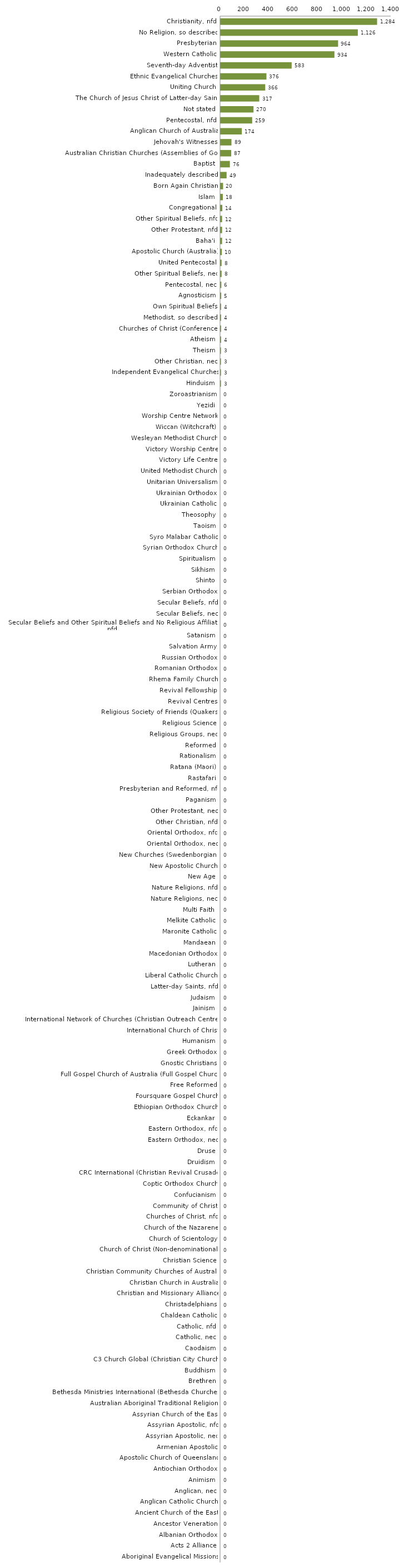
| Category | Series 0 |
|---|---|
| Christianity, nfd | 1284 |
| No Religion, so described | 1126 |
| Presbyterian | 964 |
| Western Catholic | 934 |
| Seventh-day Adventist | 583 |
| Ethnic Evangelical Churches | 376 |
| Uniting Church | 366 |
| The Church of Jesus Christ of Latter-day Saints | 317 |
| Not stated | 270 |
| Pentecostal, nfd | 259 |
| Anglican Church of Australia | 174 |
| Jehovah's Witnesses | 89 |
| Australian Christian Churches (Assemblies of God) | 87 |
| Baptist | 76 |
| Inadequately described | 49 |
| Born Again Christian | 20 |
| Islam | 18 |
| Congregational | 14 |
| Other Spiritual Beliefs, nfd | 12 |
| Other Protestant, nfd | 12 |
| Baha'i | 12 |
| Apostolic Church (Australia) | 10 |
| United Pentecostal | 8 |
| Other Spiritual Beliefs, nec | 8 |
| Pentecostal, nec | 6 |
| Agnosticism | 5 |
| Own Spiritual Beliefs | 4 |
| Methodist, so described | 4 |
| Churches of Christ (Conference) | 4 |
| Atheism | 4 |
| Theism | 3 |
| Other Christian, nec | 3 |
| Independent Evangelical Churches | 3 |
| Hinduism | 3 |
| Zoroastrianism | 0 |
| Yezidi | 0 |
| Worship Centre Network | 0 |
| Wiccan (Witchcraft) | 0 |
| Wesleyan Methodist Church | 0 |
| Victory Worship Centre | 0 |
| Victory Life Centre | 0 |
| United Methodist Church | 0 |
| Unitarian Universalism | 0 |
| Ukrainian Orthodox | 0 |
| Ukrainian Catholic | 0 |
| Theosophy | 0 |
| Taoism | 0 |
| Syro Malabar Catholic | 0 |
| Syrian Orthodox Church | 0 |
| Spiritualism | 0 |
| Sikhism | 0 |
| Shinto | 0 |
| Serbian Orthodox | 0 |
| Secular Beliefs, nfd | 0 |
| Secular Beliefs, nec | 0 |
| Secular Beliefs and Other Spiritual Beliefs and No Religious Affiliation, nfd | 0 |
| Satanism | 0 |
| Salvation Army | 0 |
| Russian Orthodox | 0 |
| Romanian Orthodox | 0 |
| Rhema Family Church | 0 |
| Revival Fellowship | 0 |
| Revival Centres | 0 |
| Religious Society of Friends (Quakers) | 0 |
| Religious Science | 0 |
| Religious Groups, nec | 0 |
| Reformed | 0 |
| Rationalism | 0 |
| Ratana (Maori) | 0 |
| Rastafari | 0 |
| Presbyterian and Reformed, nfd | 0 |
| Paganism | 0 |
| Other Protestant, nec | 0 |
| Other Christian, nfd | 0 |
| Oriental Orthodox, nfd | 0 |
| Oriental Orthodox, nec | 0 |
| New Churches (Swedenborgian) | 0 |
| New Apostolic Church | 0 |
| New Age | 0 |
| Nature Religions, nfd | 0 |
| Nature Religions, nec | 0 |
| Multi Faith | 0 |
| Melkite Catholic | 0 |
| Maronite Catholic | 0 |
| Mandaean | 0 |
| Macedonian Orthodox | 0 |
| Lutheran | 0 |
| Liberal Catholic Church | 0 |
| Latter-day Saints, nfd | 0 |
| Judaism | 0 |
| Jainism | 0 |
| International Network of Churches (Christian Outreach Centres) | 0 |
| International Church of Christ | 0 |
| Humanism | 0 |
| Greek Orthodox | 0 |
| Gnostic Christians | 0 |
| Full Gospel Church of Australia (Full Gospel Church) | 0 |
| Free Reformed | 0 |
| Foursquare Gospel Church | 0 |
| Ethiopian Orthodox Church | 0 |
| Eckankar | 0 |
| Eastern Orthodox, nfd | 0 |
| Eastern Orthodox, nec | 0 |
| Druse | 0 |
| Druidism | 0 |
| CRC International (Christian Revival Crusade) | 0 |
| Coptic Orthodox Church | 0 |
| Confucianism | 0 |
| Community of Christ | 0 |
| Churches of Christ, nfd | 0 |
| Church of the Nazarene | 0 |
| Church of Scientology | 0 |
| Church of Christ (Non-denominational) | 0 |
| Christian Science | 0 |
| Christian Community Churches of Australia | 0 |
| Christian Church in Australia | 0 |
| Christian and Missionary Alliance | 0 |
| Christadelphians | 0 |
| Chaldean Catholic | 0 |
| Catholic, nfd | 0 |
| Catholic, nec | 0 |
| Caodaism | 0 |
| C3 Church Global (Christian City Church) | 0 |
| Buddhism | 0 |
| Brethren | 0 |
| Bethesda Ministries International (Bethesda Churches) | 0 |
| Australian Aboriginal Traditional Religions | 0 |
| Assyrian Church of the East | 0 |
| Assyrian Apostolic, nfd | 0 |
| Assyrian Apostolic, nec | 0 |
| Armenian Apostolic | 0 |
| Apostolic Church of Queensland | 0 |
| Antiochian Orthodox | 0 |
| Animism | 0 |
| Anglican, nec | 0 |
| Anglican Catholic Church | 0 |
| Ancient Church of the East | 0 |
| Ancestor Veneration | 0 |
| Albanian Orthodox | 0 |
| Acts 2 Alliance | 0 |
| Aboriginal Evangelical Missions | 0 |